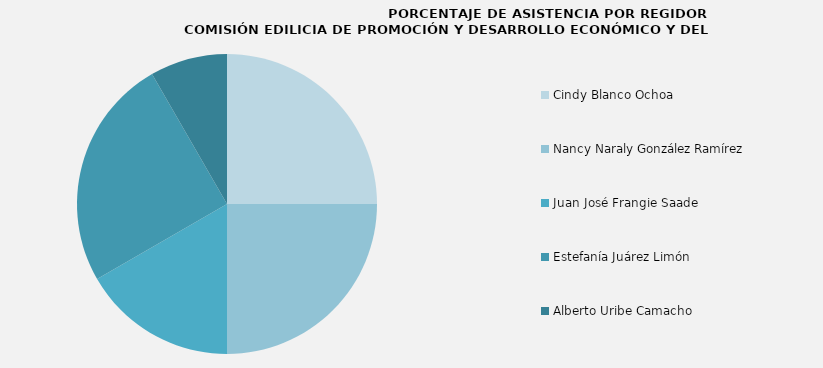
| Category | Series 0 |
|---|---|
| Cindy Blanco Ochoa | 100 |
| Nancy Naraly González Ramírez | 100 |
| Juan José Frangie Saade | 66.667 |
| Estefanía Juárez Limón | 100 |
| Alberto Uribe Camacho | 33.333 |